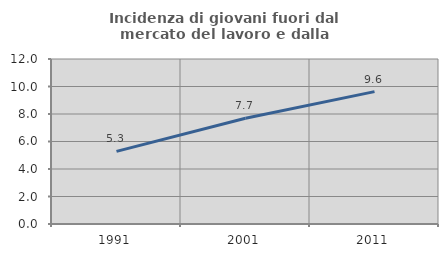
| Category | Incidenza di giovani fuori dal mercato del lavoro e dalla formazione  |
|---|---|
| 1991.0 | 5.284 |
| 2001.0 | 7.69 |
| 2011.0 | 9.627 |